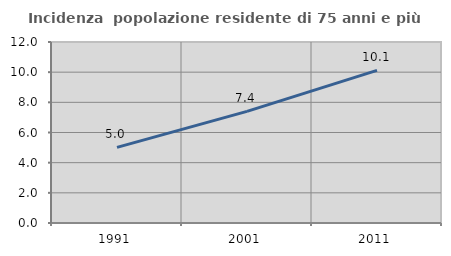
| Category | Incidenza  popolazione residente di 75 anni e più |
|---|---|
| 1991.0 | 5.013 |
| 2001.0 | 7.402 |
| 2011.0 | 10.121 |